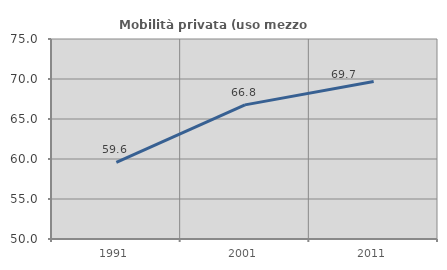
| Category | Mobilità privata (uso mezzo privato) |
|---|---|
| 1991.0 | 59.567 |
| 2001.0 | 66.765 |
| 2011.0 | 69.693 |